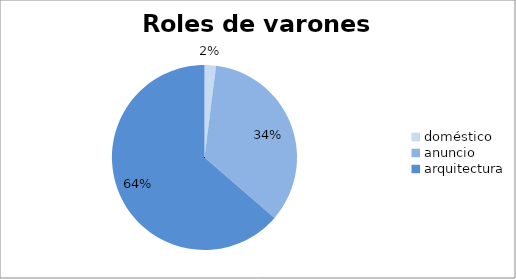
| Category | roles varones |
|---|---|
| doméstico | 12 |
| anuncio | 206 |
| arquitectura | 382 |